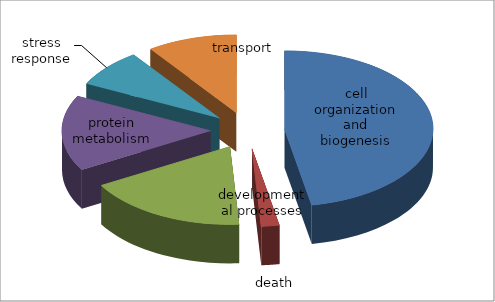
| Category | Series 0 |
|---|---|
| cell organization and biogenesis | 24 |
| death | 1 |
| developmental processes | 9 |
| protein metabolism | 8 |
| stress response | 4 |
| transport | 5 |